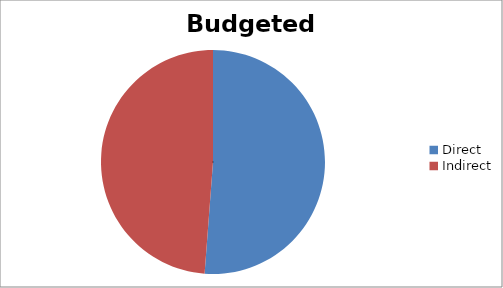
| Category | Budgeted Expenses |
|---|---|
| Direct | 30099500 |
| Indirect | 28691350 |